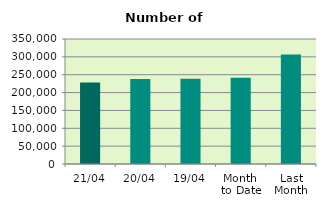
| Category | Series 0 |
|---|---|
| 21/04 | 228042 |
| 20/04 | 237718 |
| 19/04 | 238812 |
| Month 
to Date | 241293.667 |
| Last
Month | 306734.174 |